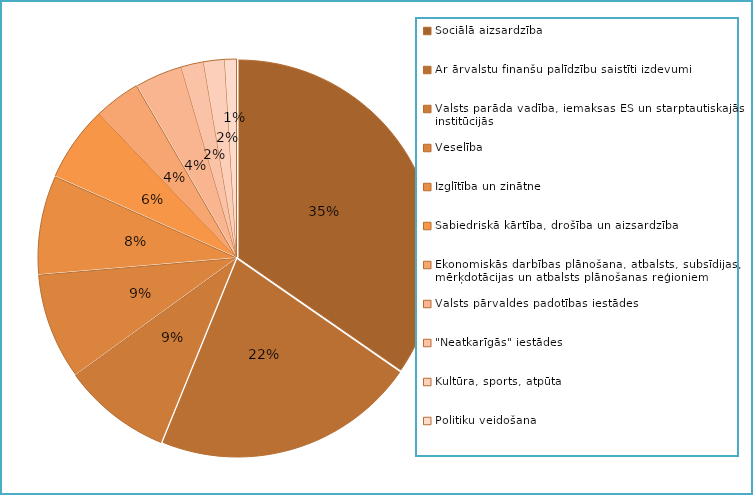
| Category | Series 0 |
|---|---|
| Sociālā aizsardzība | 1603152173 |
| Ar ārvalstu finanšu palīdzību saistīti izdevumi | 994928661 |
| Valsts parāda vadība, iemaksas ES un starptautiskajās institūcijās | 410282735 |
| Veselība | 399765893 |
| Izglītība un zinātne | 372142704 |
| Sabiedriskā kārtība, drošība un aizsardzība | 284377682 |
| Ekonomiskās darbības plānošana, atbalsts, subsīdijas, mērķdotācijas un atbalsts plānošanas reģioniem | 175192226 |
| Valsts pārvaldes padotības iestādes | 178030317 |
| "Neatkarīgās" iestādes | 85443510 |
| Kultūra, sports, atpūta | 79427203 |
| Politiku veidošana | 44432063 |